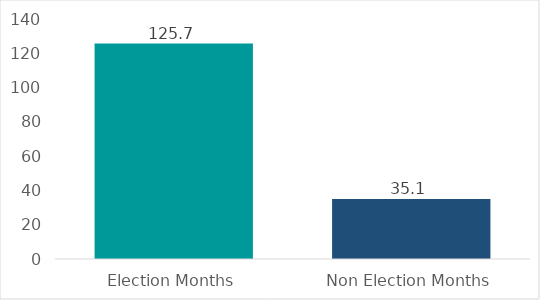
| Category | Average Monthly Payments |
|---|---|
| Election Months | 125.7 |
| Non Election Months | 35.05 |